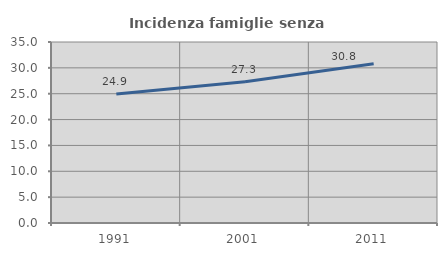
| Category | Incidenza famiglie senza nuclei |
|---|---|
| 1991.0 | 24.929 |
| 2001.0 | 27.298 |
| 2011.0 | 30.789 |